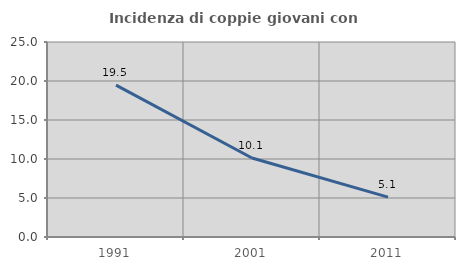
| Category | Incidenza di coppie giovani con figli |
|---|---|
| 1991.0 | 19.476 |
| 2001.0 | 10.135 |
| 2011.0 | 5.111 |